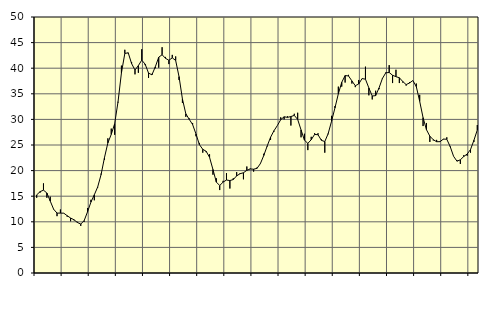
| Category | Piggar | Series 1 |
|---|---|---|
| nan | 14.7 | 15.26 |
| 87.0 | 15.7 | 15.89 |
| 87.0 | 17.5 | 16.18 |
| 87.0 | 14.7 | 15.63 |
| nan | 14.9 | 14.04 |
| 88.0 | 12.4 | 12.45 |
| 88.0 | 11.1 | 11.7 |
| 88.0 | 12.4 | 11.7 |
| nan | 11.7 | 11.68 |
| 89.0 | 11 | 11.19 |
| 89.0 | 10.1 | 10.74 |
| 89.0 | 10.3 | 10.4 |
| nan | 10 | 9.87 |
| 90.0 | 9.2 | 9.56 |
| 90.0 | 10 | 10.23 |
| 90.0 | 12.7 | 11.95 |
| nan | 14.3 | 13.85 |
| 91.0 | 14.2 | 15.28 |
| 91.0 | 16.7 | 16.81 |
| 91.0 | 19.4 | 19.22 |
| nan | 22.1 | 22.54 |
| 92.0 | 26.3 | 25.41 |
| 92.0 | 28.2 | 27.08 |
| 92.0 | 27 | 29.15 |
| nan | 33.3 | 33.45 |
| 93.0 | 40.5 | 39.08 |
| 93.0 | 43.6 | 42.88 |
| 93.0 | 42.9 | 43.01 |
| nan | 41.2 | 40.9 |
| 94.0 | 38.8 | 39.64 |
| 94.0 | 39.1 | 40.51 |
| 94.0 | 43.7 | 41.57 |
| nan | 40.6 | 40.79 |
| 95.0 | 38.1 | 39.05 |
| 95.0 | 38.9 | 38.7 |
| 95.0 | 40 | 40.28 |
| nan | 40.1 | 42.14 |
| 96.0 | 44.1 | 42.63 |
| 96.0 | 42.2 | 41.93 |
| 96.0 | 40.8 | 41.55 |
| nan | 42.6 | 42.02 |
| 97.0 | 42.3 | 41.51 |
| 97.0 | 37.7 | 38.35 |
| 97.0 | 33.2 | 33.99 |
| nan | 30.5 | 31.1 |
| 98.0 | 30.2 | 30.02 |
| 98.0 | 29.3 | 29 |
| 98.0 | 26.7 | 27.15 |
| nan | 25.4 | 25.08 |
| 99.0 | 23.5 | 24.16 |
| 99.0 | 23.6 | 23.77 |
| 99.0 | 23.2 | 22.59 |
| nan | 19.2 | 20.22 |
| 0.0 | 18.5 | 17.75 |
| 0.0 | 16.2 | 17.09 |
| 0.0 | 18 | 17.75 |
| nan | 19.5 | 18.16 |
| 1.0 | 16.5 | 18.06 |
| 1.0 | 18.5 | 18.25 |
| 1.0 | 19.7 | 18.97 |
| nan | 19.5 | 19.39 |
| 2.0 | 18.3 | 19.58 |
| 2.0 | 20.8 | 20.05 |
| 2.0 | 20.4 | 20.32 |
| nan | 19.8 | 20.27 |
| 3.0 | 20.6 | 20.44 |
| 3.0 | 21.3 | 21.36 |
| 3.0 | 23.3 | 22.95 |
| nan | 24.7 | 24.79 |
| 4.0 | 26 | 26.51 |
| 4.0 | 27.6 | 27.78 |
| 4.0 | 28.8 | 28.79 |
| nan | 30.4 | 29.95 |
| 5.0 | 30 | 30.51 |
| 5.0 | 30.6 | 30.4 |
| 5.0 | 28.8 | 30.56 |
| nan | 31.1 | 30.78 |
| 6.0 | 31.3 | 30 |
| 6.0 | 26.5 | 27.95 |
| 6.0 | 27.2 | 25.94 |
| nan | 24 | 25.32 |
| 7.0 | 26.6 | 26.03 |
| 7.0 | 27.3 | 27.07 |
| 7.0 | 27.3 | 27 |
| nan | 26.1 | 25.91 |
| 8.0 | 23.5 | 25.67 |
| 8.0 | 27.1 | 27.23 |
| 8.0 | 30.7 | 29.65 |
| nan | 32.6 | 32.25 |
| 9.0 | 36.4 | 35 |
| 9.0 | 36.4 | 37.24 |
| 9.0 | 37.2 | 38.56 |
| nan | 38.7 | 38.49 |
| 10.0 | 37 | 37.52 |
| 10.0 | 36.3 | 36.58 |
| 10.0 | 37.7 | 36.91 |
| nan | 38 | 37.97 |
| 11.0 | 40.3 | 37.85 |
| 11.0 | 34.7 | 36.15 |
| 11.0 | 33.9 | 34.57 |
| nan | 35.6 | 34.64 |
| 12.0 | 35.9 | 36.13 |
| 12.0 | 37.9 | 37.99 |
| 12.0 | 39.2 | 39.1 |
| nan | 40.6 | 39.16 |
| 13.0 | 37.1 | 38.62 |
| 13.0 | 39.7 | 38.34 |
| 13.0 | 37.1 | 38.14 |
| nan | 37.2 | 37.4 |
| 14.0 | 36.6 | 36.8 |
| 14.0 | 37.3 | 37.11 |
| 14.0 | 37.6 | 37.59 |
| nan | 37 | 36.4 |
| 15.0 | 34.8 | 33.54 |
| 15.0 | 28.7 | 30.34 |
| 15.0 | 29.3 | 27.99 |
| nan | 25.6 | 26.72 |
| 16.0 | 25.9 | 26.04 |
| 16.0 | 26 | 25.64 |
| 16.0 | 25.6 | 25.65 |
| nan | 26.1 | 26.16 |
| 17.0 | 26.5 | 26.12 |
| 17.0 | 24.8 | 24.69 |
| 17.0 | 22.8 | 22.79 |
| nan | 22 | 21.84 |
| 18.0 | 21.3 | 22.11 |
| 18.0 | 23 | 22.75 |
| 18.0 | 22.9 | 23.23 |
| nan | 23.5 | 24.11 |
| 19.0 | 25.6 | 25.92 |
| 19.0 | 28.9 | 27.93 |